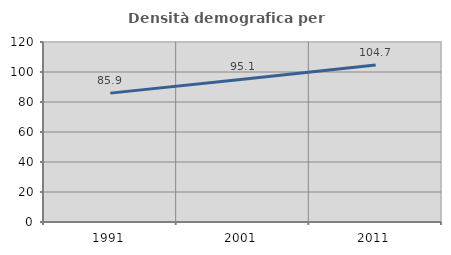
| Category | Densità demografica |
|---|---|
| 1991.0 | 85.912 |
| 2001.0 | 95.104 |
| 2011.0 | 104.738 |